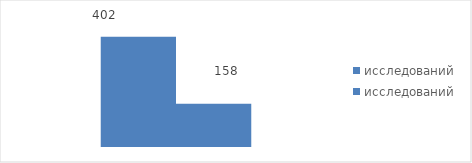
| Category | исследований |
|---|---|
| 0 | 158 |